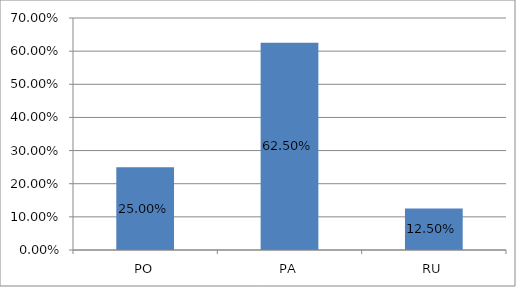
| Category | Series 0 |
|---|---|
| PO | 0.25 |
| PA | 0.625 |
| RU | 0.125 |